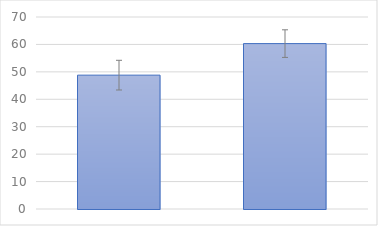
| Category | Series 0 |
|---|---|
| 0 | 48.8 |
| 1 | 60.3 |